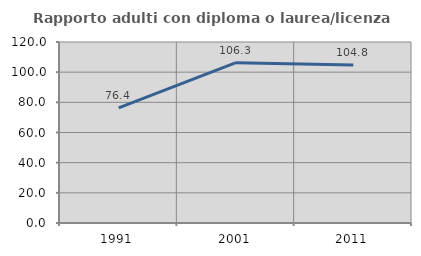
| Category | Rapporto adulti con diploma o laurea/licenza media  |
|---|---|
| 1991.0 | 76.389 |
| 2001.0 | 106.289 |
| 2011.0 | 104.762 |